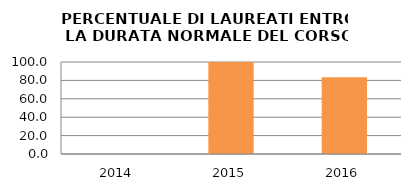
| Category | 2014 2015 2016 |
|---|---|
| 2014.0 | 0 |
| 2015.0 | 100 |
| 2016.0 | 83.333 |